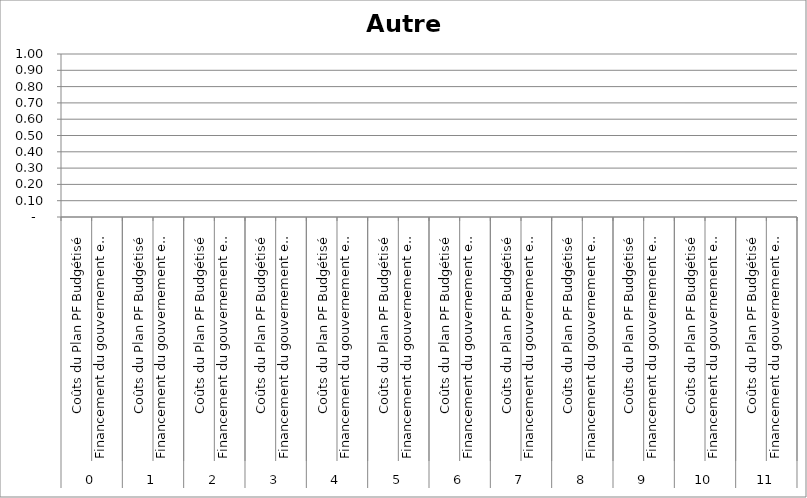
| Category | Autre 8 |
|---|---|
| 0 | 0 |
| 1 | 0 |
| 2 | 0 |
| 3 | 0 |
| 4 | 0 |
| 5 | 0 |
| 6 | 0 |
| 7 | 0 |
| 8 | 0 |
| 9 | 0 |
| 10 | 0 |
| 11 | 0 |
| 12 | 0 |
| 13 | 0 |
| 14 | 0 |
| 15 | 0 |
| 16 | 0 |
| 17 | 0 |
| 18 | 0 |
| 19 | 0 |
| 20 | 0 |
| 21 | 0 |
| 22 | 0 |
| 23 | 0 |